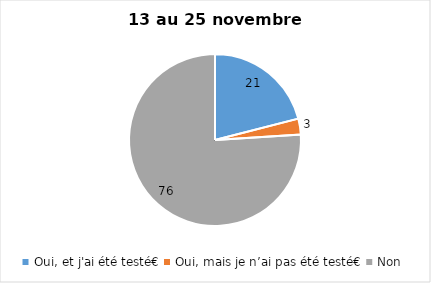
| Category | Series 0 |
|---|---|
| Oui, et j'ai été testé€ | 21 |
| Oui, mais je n’ai pas été testé€ | 3 |
| Non | 76 |